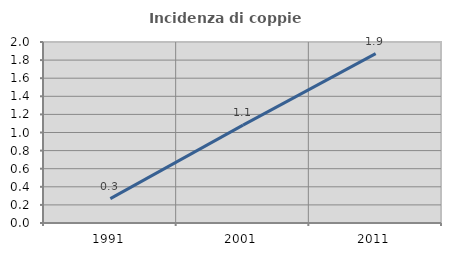
| Category | Incidenza di coppie miste |
|---|---|
| 1991.0 | 0.269 |
| 2001.0 | 1.081 |
| 2011.0 | 1.871 |